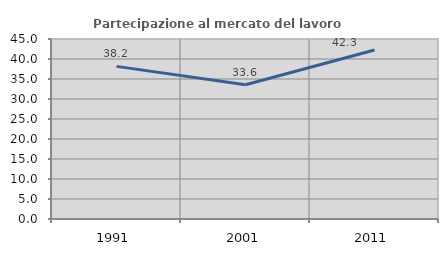
| Category | Partecipazione al mercato del lavoro  femminile |
|---|---|
| 1991.0 | 38.159 |
| 2001.0 | 33.562 |
| 2011.0 | 42.259 |